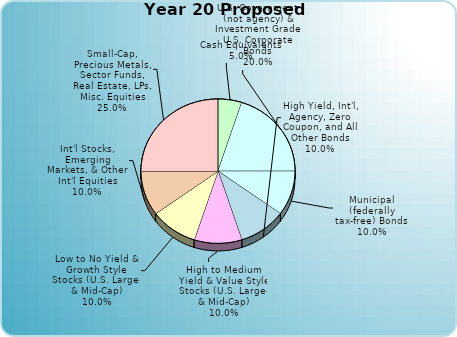
| Category | Series 0 |
|---|---|
| Cash Equivalents | 0.05 |
| U.S. Government (not agency) & Investment Grade U.S. Corporate Bonds | 0.2 |
| Municipal (federally tax-free) Bonds | 0.1 |
| High Yield, Int'l, Agency, Zero Coupon, and All Other Bonds | 0.1 |
| High to Medium Yield & Value Style Stocks (U.S. Large- & Mid-Cap) | 0.1 |
| Low to No Yield & Growth Style Stocks (U.S. Large- & Mid-Cap) | 0.1 |
| Int'l Stocks, Emerging Markets, & Other Int'l Equities | 0.1 |
| Small-Cap, Precious Metals, Sector Funds, Real Estate, LPs, Misc. Equities | 0.25 |